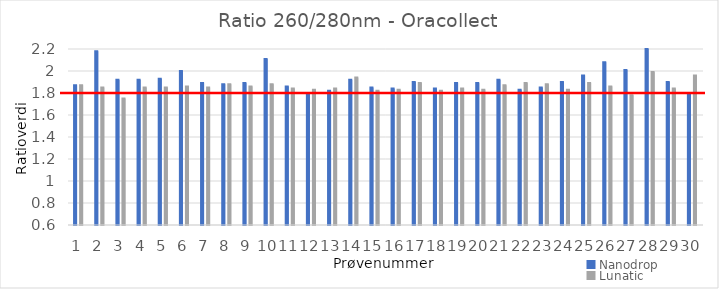
| Category | Nanodrop | Lunatic |
|---|---|---|
| 0 | 1.87 | 1.87 |
| 1 | 2.18 | 1.85 |
| 2 | 1.92 | 1.75 |
| 3 | 1.92 | 1.85 |
| 4 | 1.93 | 1.85 |
| 5 | 2 | 1.86 |
| 6 | 1.89 | 1.85 |
| 7 | 1.88 | 1.88 |
| 8 | 1.89 | 1.86 |
| 9 | 2.11 | 1.88 |
| 10 | 1.86 | 1.84 |
| 11 | 1.79 | 1.83 |
| 12 | 1.82 | 1.84 |
| 13 | 1.92 | 1.94 |
| 14 | 1.85 | 1.82 |
| 15 | 1.84 | 1.83 |
| 16 | 1.9 | 1.89 |
| 17 | 1.84 | 1.82 |
| 18 | 1.89 | 1.84 |
| 19 | 1.89 | 1.83 |
| 20 | 1.92 | 1.87 |
| 21 | 1.83 | 1.89 |
| 22 | 1.85 | 1.88 |
| 23 | 1.9 | 1.83 |
| 24 | 1.96 | 1.89 |
| 25 | 2.08 | 1.86 |
| 26 | 2.01 | 1.78 |
| 27 | 2.22 | 1.99 |
| 28 | 1.9 | 1.84 |
| 29 | 1.8 | 1.96 |